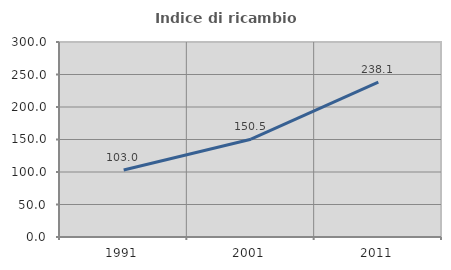
| Category | Indice di ricambio occupazionale  |
|---|---|
| 1991.0 | 103.014 |
| 2001.0 | 150.497 |
| 2011.0 | 238.095 |